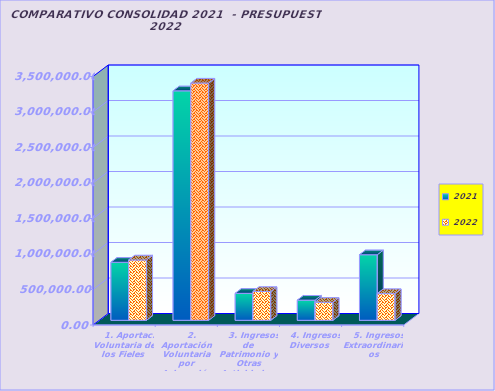
| Category | 2021 | 2022 |
|---|---|---|
|    1. Aportac. Voluntaria de los Fieles  | 817395.6 | 849900 |
|    2. Aportación Voluntaria por Asignación Tributaria  | 3231618.71 | 3341470 |
|    3. Ingresos de Patrimonio y Otras Actividades  | 379928.28 | 405755 |
|    4. Ingresos Diversos  | 284520.59 | 253905 |
|    5. Ingresos Extraordinarios | 923290.04 | 375990 |